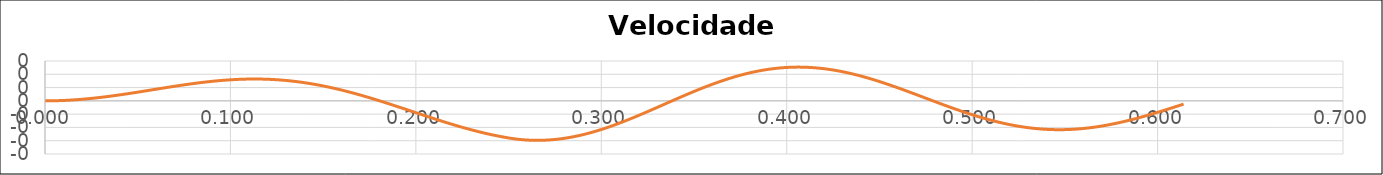
| Category | v (m/s) |
|---|---|
| 0.0 | 0 |
| 0.00028 | 0 |
| 0.00056 | 0 |
| 0.0008399999999999999 | 0 |
| 0.00112 | 0 |
| 0.0013999999999999998 | 0 |
| 0.0016799999999999996 | 0 |
| 0.0019599999999999995 | 0 |
| 0.0022399999999999994 | 0 |
| 0.0025199999999999992 | 0 |
| 0.002799999999999999 | 0 |
| 0.003079999999999999 | 0 |
| 0.003359999999999999 | 0 |
| 0.0036399999999999987 | 0 |
| 0.003919999999999999 | 0 |
| 0.004199999999999999 | 0.001 |
| 0.004479999999999999 | 0.001 |
| 0.004759999999999999 | 0.001 |
| 0.0050399999999999985 | 0.001 |
| 0.005319999999999998 | 0.001 |
| 0.005599999999999998 | 0.001 |
| 0.005879999999999998 | 0.001 |
| 0.006159999999999998 | 0.001 |
| 0.006439999999999998 | 0.001 |
| 0.006719999999999998 | 0.001 |
| 0.0069999999999999975 | 0.001 |
| 0.007279999999999997 | 0.002 |
| 0.007559999999999997 | 0.002 |
| 0.007839999999999998 | 0.002 |
| 0.008119999999999999 | 0.002 |
| 0.0084 | 0.002 |
| 0.00868 | 0.002 |
| 0.008960000000000001 | 0.002 |
| 0.009240000000000002 | 0.003 |
| 0.009520000000000002 | 0.003 |
| 0.009800000000000003 | 0.003 |
| 0.010080000000000004 | 0.003 |
| 0.010360000000000005 | 0.003 |
| 0.010640000000000005 | 0.003 |
| 0.010920000000000006 | 0.004 |
| 0.011200000000000007 | 0.004 |
| 0.011480000000000008 | 0.004 |
| 0.011760000000000008 | 0.004 |
| 0.012040000000000009 | 0.004 |
| 0.01232000000000001 | 0.005 |
| 0.01260000000000001 | 0.005 |
| 0.012880000000000011 | 0.005 |
| 0.013160000000000012 | 0.005 |
| 0.013440000000000013 | 0.005 |
| 0.013720000000000013 | 0.006 |
| 0.014000000000000014 | 0.006 |
| 0.014280000000000015 | 0.006 |
| 0.014560000000000016 | 0.006 |
| 0.014840000000000016 | 0.007 |
| 0.015120000000000017 | 0.007 |
| 0.015400000000000018 | 0.007 |
| 0.015680000000000017 | 0.007 |
| 0.015960000000000016 | 0.008 |
| 0.016240000000000015 | 0.008 |
| 0.016520000000000014 | 0.008 |
| 0.016800000000000013 | 0.008 |
| 0.017080000000000012 | 0.009 |
| 0.01736000000000001 | 0.009 |
| 0.01764000000000001 | 0.009 |
| 0.01792000000000001 | 0.01 |
| 0.018200000000000008 | 0.01 |
| 0.018480000000000007 | 0.01 |
| 0.018760000000000006 | 0.011 |
| 0.019040000000000005 | 0.011 |
| 0.019320000000000004 | 0.011 |
| 0.019600000000000003 | 0.011 |
| 0.019880000000000002 | 0.012 |
| 0.02016 | 0.012 |
| 0.02044 | 0.012 |
| 0.02072 | 0.013 |
| 0.020999999999999998 | 0.013 |
| 0.021279999999999997 | 0.013 |
| 0.021559999999999996 | 0.014 |
| 0.021839999999999995 | 0.014 |
| 0.022119999999999994 | 0.015 |
| 0.022399999999999993 | 0.015 |
| 0.022679999999999992 | 0.015 |
| 0.02295999999999999 | 0.016 |
| 0.02323999999999999 | 0.016 |
| 0.02351999999999999 | 0.016 |
| 0.023799999999999988 | 0.017 |
| 0.024079999999999987 | 0.017 |
| 0.024359999999999986 | 0.018 |
| 0.024639999999999985 | 0.018 |
| 0.024919999999999984 | 0.018 |
| 0.025199999999999983 | 0.019 |
| 0.025479999999999982 | 0.019 |
| 0.02575999999999998 | 0.02 |
| 0.02603999999999998 | 0.02 |
| 0.02631999999999998 | 0.02 |
| 0.026599999999999978 | 0.021 |
| 0.026879999999999977 | 0.021 |
| 0.027159999999999976 | 0.022 |
| 0.027439999999999975 | 0.022 |
| 0.027719999999999974 | 0.022 |
| 0.027999999999999973 | 0.023 |
| 0.028279999999999972 | 0.023 |
| 0.02855999999999997 | 0.024 |
| 0.02883999999999997 | 0.024 |
| 0.02911999999999997 | 0.025 |
| 0.029399999999999968 | 0.025 |
| 0.029679999999999967 | 0.026 |
| 0.029959999999999966 | 0.026 |
| 0.030239999999999965 | 0.026 |
| 0.030519999999999964 | 0.027 |
| 0.030799999999999963 | 0.027 |
| 0.031079999999999962 | 0.028 |
| 0.031359999999999964 | 0.028 |
| 0.03163999999999997 | 0.029 |
| 0.03191999999999997 | 0.029 |
| 0.03219999999999997 | 0.03 |
| 0.032479999999999974 | 0.03 |
| 0.03275999999999998 | 0.031 |
| 0.03303999999999998 | 0.031 |
| 0.03331999999999998 | 0.032 |
| 0.033599999999999984 | 0.032 |
| 0.033879999999999987 | 0.033 |
| 0.03415999999999999 | 0.033 |
| 0.03443999999999999 | 0.034 |
| 0.034719999999999994 | 0.034 |
| 0.034999999999999996 | 0.035 |
| 0.03528 | 0.035 |
| 0.03556 | 0.036 |
| 0.035840000000000004 | 0.036 |
| 0.036120000000000006 | 0.037 |
| 0.03640000000000001 | 0.037 |
| 0.03668000000000001 | 0.038 |
| 0.036960000000000014 | 0.038 |
| 0.037240000000000016 | 0.039 |
| 0.03752000000000002 | 0.04 |
| 0.03780000000000002 | 0.04 |
| 0.038080000000000024 | 0.041 |
| 0.038360000000000026 | 0.041 |
| 0.03864000000000003 | 0.042 |
| 0.03892000000000003 | 0.042 |
| 0.03920000000000003 | 0.043 |
| 0.039480000000000036 | 0.043 |
| 0.03976000000000004 | 0.044 |
| 0.04004000000000004 | 0.044 |
| 0.04032000000000004 | 0.045 |
| 0.040600000000000046 | 0.046 |
| 0.04088000000000005 | 0.046 |
| 0.04116000000000005 | 0.047 |
| 0.04144000000000005 | 0.047 |
| 0.041720000000000056 | 0.048 |
| 0.04200000000000006 | 0.048 |
| 0.04228000000000006 | 0.049 |
| 0.04256000000000006 | 0.05 |
| 0.042840000000000066 | 0.05 |
| 0.04312000000000007 | 0.051 |
| 0.04340000000000007 | 0.051 |
| 0.04368000000000007 | 0.052 |
| 0.043960000000000075 | 0.052 |
| 0.04424000000000008 | 0.053 |
| 0.04452000000000008 | 0.054 |
| 0.04480000000000008 | 0.054 |
| 0.045080000000000085 | 0.055 |
| 0.04536000000000009 | 0.055 |
| 0.04564000000000009 | 0.056 |
| 0.04592000000000009 | 0.057 |
| 0.046200000000000095 | 0.057 |
| 0.0464800000000001 | 0.058 |
| 0.0467600000000001 | 0.058 |
| 0.0470400000000001 | 0.059 |
| 0.047320000000000105 | 0.06 |
| 0.04760000000000011 | 0.06 |
| 0.04788000000000011 | 0.061 |
| 0.04816000000000011 | 0.061 |
| 0.048440000000000115 | 0.062 |
| 0.04872000000000012 | 0.063 |
| 0.04900000000000012 | 0.063 |
| 0.04928000000000012 | 0.064 |
| 0.049560000000000125 | 0.065 |
| 0.04984000000000013 | 0.065 |
| 0.05012000000000013 | 0.066 |
| 0.05040000000000013 | 0.066 |
| 0.050680000000000135 | 0.067 |
| 0.05096000000000014 | 0.068 |
| 0.05124000000000014 | 0.068 |
| 0.05152000000000014 | 0.069 |
| 0.051800000000000145 | 0.069 |
| 0.05208000000000015 | 0.07 |
| 0.05236000000000015 | 0.071 |
| 0.05264000000000015 | 0.071 |
| 0.052920000000000154 | 0.072 |
| 0.05320000000000016 | 0.073 |
| 0.05348000000000016 | 0.073 |
| 0.05376000000000016 | 0.074 |
| 0.054040000000000164 | 0.074 |
| 0.05432000000000017 | 0.075 |
| 0.05460000000000017 | 0.076 |
| 0.05488000000000017 | 0.076 |
| 0.055160000000000174 | 0.077 |
| 0.05544000000000018 | 0.078 |
| 0.05572000000000018 | 0.078 |
| 0.05600000000000018 | 0.079 |
| 0.056280000000000184 | 0.08 |
| 0.056560000000000187 | 0.08 |
| 0.05684000000000019 | 0.081 |
| 0.05712000000000019 | 0.081 |
| 0.057400000000000194 | 0.082 |
| 0.057680000000000196 | 0.083 |
| 0.0579600000000002 | 0.083 |
| 0.0582400000000002 | 0.084 |
| 0.058520000000000204 | 0.085 |
| 0.058800000000000206 | 0.085 |
| 0.05908000000000021 | 0.086 |
| 0.05936000000000021 | 0.086 |
| 0.059640000000000214 | 0.087 |
| 0.059920000000000216 | 0.088 |
| 0.06020000000000022 | 0.088 |
| 0.06048000000000022 | 0.089 |
| 0.060760000000000224 | 0.09 |
| 0.061040000000000226 | 0.09 |
| 0.06132000000000023 | 0.091 |
| 0.06160000000000023 | 0.092 |
| 0.06188000000000023 | 0.092 |
| 0.062160000000000236 | 0.093 |
| 0.06244000000000024 | 0.093 |
| 0.06272000000000023 | 0.094 |
| 0.06300000000000024 | 0.095 |
| 0.06328000000000024 | 0.095 |
| 0.06356000000000024 | 0.096 |
| 0.06384000000000024 | 0.097 |
| 0.06412000000000025 | 0.097 |
| 0.06440000000000025 | 0.098 |
| 0.06468000000000025 | 0.098 |
| 0.06496000000000025 | 0.099 |
| 0.06524000000000026 | 0.1 |
| 0.06552000000000026 | 0.1 |
| 0.06580000000000026 | 0.101 |
| 0.06608000000000026 | 0.102 |
| 0.06636000000000027 | 0.102 |
| 0.06664000000000027 | 0.103 |
| 0.06692000000000027 | 0.103 |
| 0.06720000000000027 | 0.104 |
| 0.06748000000000028 | 0.105 |
| 0.06776000000000028 | 0.105 |
| 0.06804000000000028 | 0.106 |
| 0.06832000000000028 | 0.106 |
| 0.06860000000000029 | 0.107 |
| 0.06888000000000029 | 0.108 |
| 0.06916000000000029 | 0.108 |
| 0.0694400000000003 | 0.109 |
| 0.0697200000000003 | 0.109 |
| 0.0700000000000003 | 0.11 |
| 0.0702800000000003 | 0.111 |
| 0.0705600000000003 | 0.111 |
| 0.0708400000000003 | 0.112 |
| 0.07112000000000031 | 0.112 |
| 0.07140000000000031 | 0.113 |
| 0.07168000000000031 | 0.114 |
| 0.07196000000000032 | 0.114 |
| 0.07224000000000032 | 0.115 |
| 0.07252000000000032 | 0.115 |
| 0.07280000000000032 | 0.116 |
| 0.07308000000000033 | 0.117 |
| 0.07336000000000033 | 0.117 |
| 0.07364000000000033 | 0.118 |
| 0.07392000000000033 | 0.118 |
| 0.07420000000000034 | 0.119 |
| 0.07448000000000034 | 0.119 |
| 0.07476000000000034 | 0.12 |
| 0.07504000000000034 | 0.121 |
| 0.07532000000000035 | 0.121 |
| 0.07560000000000035 | 0.122 |
| 0.07588000000000035 | 0.122 |
| 0.07616000000000035 | 0.123 |
| 0.07644000000000035 | 0.123 |
| 0.07672000000000036 | 0.124 |
| 0.07700000000000036 | 0.124 |
| 0.07728000000000036 | 0.125 |
| 0.07756000000000036 | 0.126 |
| 0.07784000000000037 | 0.126 |
| 0.07812000000000037 | 0.127 |
| 0.07840000000000037 | 0.127 |
| 0.07868000000000037 | 0.128 |
| 0.07896000000000038 | 0.128 |
| 0.07924000000000038 | 0.129 |
| 0.07952000000000038 | 0.129 |
| 0.07980000000000038 | 0.13 |
| 0.08008000000000039 | 0.13 |
| 0.08036000000000039 | 0.131 |
| 0.08064000000000039 | 0.131 |
| 0.0809200000000004 | 0.132 |
| 0.0812000000000004 | 0.132 |
| 0.0814800000000004 | 0.133 |
| 0.0817600000000004 | 0.133 |
| 0.0820400000000004 | 0.134 |
| 0.0823200000000004 | 0.134 |
| 0.08260000000000041 | 0.135 |
| 0.08288000000000041 | 0.135 |
| 0.08316000000000041 | 0.136 |
| 0.08344000000000042 | 0.136 |
| 0.08372000000000042 | 0.137 |
| 0.08400000000000042 | 0.137 |
| 0.08428000000000042 | 0.138 |
| 0.08456000000000043 | 0.138 |
| 0.08484000000000043 | 0.139 |
| 0.08512000000000043 | 0.139 |
| 0.08540000000000043 | 0.14 |
| 0.08568000000000044 | 0.14 |
| 0.08596000000000044 | 0.141 |
| 0.08624000000000044 | 0.141 |
| 0.08652000000000044 | 0.142 |
| 0.08680000000000045 | 0.142 |
| 0.08708000000000045 | 0.142 |
| 0.08736000000000045 | 0.143 |
| 0.08764000000000045 | 0.143 |
| 0.08792000000000046 | 0.144 |
| 0.08820000000000046 | 0.144 |
| 0.08848000000000046 | 0.145 |
| 0.08876000000000046 | 0.145 |
| 0.08904000000000047 | 0.145 |
| 0.08932000000000047 | 0.146 |
| 0.08960000000000047 | 0.146 |
| 0.08988000000000047 | 0.147 |
| 0.09016000000000048 | 0.147 |
| 0.09044000000000048 | 0.147 |
| 0.09072000000000048 | 0.148 |
| 0.09100000000000048 | 0.148 |
| 0.09128000000000049 | 0.149 |
| 0.09156000000000049 | 0.149 |
| 0.09184000000000049 | 0.149 |
| 0.0921200000000005 | 0.15 |
| 0.0924000000000005 | 0.15 |
| 0.0926800000000005 | 0.15 |
| 0.0929600000000005 | 0.151 |
| 0.0932400000000005 | 0.151 |
| 0.0935200000000005 | 0.152 |
| 0.09380000000000051 | 0.152 |
| 0.09408000000000051 | 0.152 |
| 0.09436000000000051 | 0.153 |
| 0.09464000000000052 | 0.153 |
| 0.09492000000000052 | 0.153 |
| 0.09520000000000052 | 0.154 |
| 0.09548000000000052 | 0.154 |
| 0.09576000000000053 | 0.154 |
| 0.09604000000000053 | 0.155 |
| 0.09632000000000053 | 0.155 |
| 0.09660000000000053 | 0.155 |
| 0.09688000000000054 | 0.155 |
| 0.09716000000000054 | 0.156 |
| 0.09744000000000054 | 0.156 |
| 0.09772000000000054 | 0.156 |
| 0.09800000000000055 | 0.157 |
| 0.09828000000000055 | 0.157 |
| 0.09856000000000055 | 0.157 |
| 0.09884000000000055 | 0.157 |
| 0.09912000000000055 | 0.158 |
| 0.09940000000000056 | 0.158 |
| 0.09968000000000056 | 0.158 |
| 0.09996000000000056 | 0.158 |
| 0.10024000000000056 | 0.159 |
| 0.10052000000000057 | 0.159 |
| 0.10080000000000057 | 0.159 |
| 0.10108000000000057 | 0.159 |
| 0.10136000000000057 | 0.16 |
| 0.10164000000000058 | 0.16 |
| 0.10192000000000058 | 0.16 |
| 0.10220000000000058 | 0.16 |
| 0.10248000000000058 | 0.16 |
| 0.10276000000000059 | 0.161 |
| 0.10304000000000059 | 0.161 |
| 0.10332000000000059 | 0.161 |
| 0.1036000000000006 | 0.161 |
| 0.1038800000000006 | 0.161 |
| 0.1041600000000006 | 0.162 |
| 0.1044400000000006 | 0.162 |
| 0.1047200000000006 | 0.162 |
| 0.1050000000000006 | 0.162 |
| 0.10528000000000061 | 0.162 |
| 0.10556000000000061 | 0.162 |
| 0.10584000000000061 | 0.163 |
| 0.10612000000000062 | 0.163 |
| 0.10640000000000062 | 0.163 |
| 0.10668000000000062 | 0.163 |
| 0.10696000000000062 | 0.163 |
| 0.10724000000000063 | 0.163 |
| 0.10752000000000063 | 0.163 |
| 0.10780000000000063 | 0.163 |
| 0.10808000000000063 | 0.163 |
| 0.10836000000000064 | 0.164 |
| 0.10864000000000064 | 0.164 |
| 0.10892000000000064 | 0.164 |
| 0.10920000000000064 | 0.164 |
| 0.10948000000000065 | 0.164 |
| 0.10976000000000065 | 0.164 |
| 0.11004000000000065 | 0.164 |
| 0.11032000000000065 | 0.164 |
| 0.11060000000000066 | 0.164 |
| 0.11088000000000066 | 0.164 |
| 0.11116000000000066 | 0.164 |
| 0.11144000000000066 | 0.164 |
| 0.11172000000000067 | 0.164 |
| 0.11200000000000067 | 0.164 |
| 0.11228000000000067 | 0.164 |
| 0.11256000000000067 | 0.164 |
| 0.11284000000000068 | 0.164 |
| 0.11312000000000068 | 0.164 |
| 0.11340000000000068 | 0.164 |
| 0.11368000000000068 | 0.164 |
| 0.11396000000000069 | 0.164 |
| 0.11424000000000069 | 0.164 |
| 0.11452000000000069 | 0.164 |
| 0.1148000000000007 | 0.164 |
| 0.1150800000000007 | 0.164 |
| 0.1153600000000007 | 0.164 |
| 0.1156400000000007 | 0.164 |
| 0.1159200000000007 | 0.164 |
| 0.1162000000000007 | 0.164 |
| 0.11648000000000071 | 0.164 |
| 0.11676000000000071 | 0.164 |
| 0.11704000000000071 | 0.164 |
| 0.11732000000000072 | 0.164 |
| 0.11760000000000072 | 0.164 |
| 0.11788000000000072 | 0.163 |
| 0.11816000000000072 | 0.163 |
| 0.11844000000000073 | 0.163 |
| 0.11872000000000073 | 0.163 |
| 0.11900000000000073 | 0.163 |
| 0.11928000000000073 | 0.163 |
| 0.11956000000000074 | 0.163 |
| 0.11984000000000074 | 0.163 |
| 0.12012000000000074 | 0.162 |
| 0.12040000000000074 | 0.162 |
| 0.12068000000000075 | 0.162 |
| 0.12096000000000075 | 0.162 |
| 0.12124000000000075 | 0.162 |
| 0.12152000000000075 | 0.162 |
| 0.12180000000000075 | 0.161 |
| 0.12208000000000076 | 0.161 |
| 0.12236000000000076 | 0.161 |
| 0.12264000000000076 | 0.161 |
| 0.12292000000000076 | 0.161 |
| 0.12320000000000077 | 0.16 |
| 0.12348000000000077 | 0.16 |
| 0.12376000000000077 | 0.16 |
| 0.12404000000000077 | 0.16 |
| 0.12432000000000078 | 0.16 |
| 0.12460000000000078 | 0.159 |
| 0.12488000000000078 | 0.159 |
| 0.12516000000000077 | 0.159 |
| 0.12544000000000077 | 0.158 |
| 0.12572000000000078 | 0.158 |
| 0.12600000000000078 | 0.158 |
| 0.12628000000000078 | 0.158 |
| 0.12656000000000078 | 0.157 |
| 0.12684000000000079 | 0.157 |
| 0.1271200000000008 | 0.157 |
| 0.1274000000000008 | 0.157 |
| 0.1276800000000008 | 0.156 |
| 0.1279600000000008 | 0.156 |
| 0.1282400000000008 | 0.156 |
| 0.1285200000000008 | 0.155 |
| 0.1288000000000008 | 0.155 |
| 0.1290800000000008 | 0.155 |
| 0.1293600000000008 | 0.154 |
| 0.1296400000000008 | 0.154 |
| 0.1299200000000008 | 0.154 |
| 0.13020000000000082 | 0.153 |
| 0.13048000000000082 | 0.153 |
| 0.13076000000000082 | 0.152 |
| 0.13104000000000082 | 0.152 |
| 0.13132000000000082 | 0.152 |
| 0.13160000000000083 | 0.151 |
| 0.13188000000000083 | 0.151 |
| 0.13216000000000083 | 0.15 |
| 0.13244000000000083 | 0.15 |
| 0.13272000000000084 | 0.15 |
| 0.13300000000000084 | 0.149 |
| 0.13328000000000084 | 0.149 |
| 0.13356000000000084 | 0.148 |
| 0.13384000000000085 | 0.148 |
| 0.13412000000000085 | 0.147 |
| 0.13440000000000085 | 0.147 |
| 0.13468000000000085 | 0.146 |
| 0.13496000000000086 | 0.146 |
| 0.13524000000000086 | 0.146 |
| 0.13552000000000086 | 0.145 |
| 0.13580000000000086 | 0.145 |
| 0.13608000000000087 | 0.144 |
| 0.13636000000000087 | 0.144 |
| 0.13664000000000087 | 0.143 |
| 0.13692000000000087 | 0.143 |
| 0.13720000000000088 | 0.142 |
| 0.13748000000000088 | 0.142 |
| 0.13776000000000088 | 0.141 |
| 0.13804000000000088 | 0.14 |
| 0.1383200000000009 | 0.14 |
| 0.1386000000000009 | 0.139 |
| 0.1388800000000009 | 0.139 |
| 0.1391600000000009 | 0.138 |
| 0.1394400000000009 | 0.138 |
| 0.1397200000000009 | 0.137 |
| 0.1400000000000009 | 0.137 |
| 0.1402800000000009 | 0.136 |
| 0.1405600000000009 | 0.135 |
| 0.1408400000000009 | 0.135 |
| 0.1411200000000009 | 0.134 |
| 0.1414000000000009 | 0.134 |
| 0.14168000000000092 | 0.133 |
| 0.14196000000000092 | 0.132 |
| 0.14224000000000092 | 0.132 |
| 0.14252000000000092 | 0.131 |
| 0.14280000000000093 | 0.131 |
| 0.14308000000000093 | 0.13 |
| 0.14336000000000093 | 0.129 |
| 0.14364000000000093 | 0.129 |
| 0.14392000000000094 | 0.128 |
| 0.14420000000000094 | 0.127 |
| 0.14448000000000094 | 0.127 |
| 0.14476000000000094 | 0.126 |
| 0.14504000000000095 | 0.125 |
| 0.14532000000000095 | 0.125 |
| 0.14560000000000095 | 0.124 |
| 0.14588000000000095 | 0.123 |
| 0.14616000000000096 | 0.122 |
| 0.14644000000000096 | 0.122 |
| 0.14672000000000096 | 0.121 |
| 0.14700000000000096 | 0.12 |
| 0.14728000000000097 | 0.12 |
| 0.14756000000000097 | 0.119 |
| 0.14784000000000097 | 0.118 |
| 0.14812000000000097 | 0.117 |
| 0.14840000000000098 | 0.117 |
| 0.14868000000000098 | 0.116 |
| 0.14896000000000098 | 0.115 |
| 0.14924000000000098 | 0.114 |
| 0.14952000000000099 | 0.114 |
| 0.149800000000001 | 0.113 |
| 0.150080000000001 | 0.112 |
| 0.150360000000001 | 0.111 |
| 0.150640000000001 | 0.11 |
| 0.150920000000001 | 0.11 |
| 0.151200000000001 | 0.109 |
| 0.151480000000001 | 0.108 |
| 0.151760000000001 | 0.107 |
| 0.152040000000001 | 0.106 |
| 0.152320000000001 | 0.106 |
| 0.152600000000001 | 0.105 |
| 0.15288000000000102 | 0.104 |
| 0.15316000000000102 | 0.103 |
| 0.15344000000000102 | 0.102 |
| 0.15372000000000102 | 0.101 |
| 0.15400000000000102 | 0.101 |
| 0.15428000000000103 | 0.1 |
| 0.15456000000000103 | 0.099 |
| 0.15484000000000103 | 0.098 |
| 0.15512000000000103 | 0.097 |
| 0.15540000000000104 | 0.096 |
| 0.15568000000000104 | 0.095 |
| 0.15596000000000104 | 0.094 |
| 0.15624000000000104 | 0.094 |
| 0.15652000000000105 | 0.093 |
| 0.15680000000000105 | 0.092 |
| 0.15708000000000105 | 0.091 |
| 0.15736000000000105 | 0.09 |
| 0.15764000000000106 | 0.089 |
| 0.15792000000000106 | 0.088 |
| 0.15820000000000106 | 0.087 |
| 0.15848000000000106 | 0.086 |
| 0.15876000000000107 | 0.085 |
| 0.15904000000000107 | 0.084 |
| 0.15932000000000107 | 0.083 |
| 0.15960000000000107 | 0.082 |
| 0.15988000000000108 | 0.081 |
| 0.16016000000000108 | 0.081 |
| 0.16044000000000108 | 0.08 |
| 0.16072000000000108 | 0.079 |
| 0.1610000000000011 | 0.078 |
| 0.1612800000000011 | 0.077 |
| 0.1615600000000011 | 0.076 |
| 0.1618400000000011 | 0.075 |
| 0.1621200000000011 | 0.074 |
| 0.1624000000000011 | 0.073 |
| 0.1626800000000011 | 0.072 |
| 0.1629600000000011 | 0.071 |
| 0.1632400000000011 | 0.07 |
| 0.1635200000000011 | 0.069 |
| 0.1638000000000011 | 0.068 |
| 0.1640800000000011 | 0.067 |
| 0.16436000000000112 | 0.066 |
| 0.16464000000000112 | 0.065 |
| 0.16492000000000112 | 0.063 |
| 0.16520000000000112 | 0.062 |
| 0.16548000000000113 | 0.061 |
| 0.16576000000000113 | 0.06 |
| 0.16604000000000113 | 0.059 |
| 0.16632000000000113 | 0.058 |
| 0.16660000000000114 | 0.057 |
| 0.16688000000000114 | 0.056 |
| 0.16716000000000114 | 0.055 |
| 0.16744000000000114 | 0.054 |
| 0.16772000000000115 | 0.053 |
| 0.16800000000000115 | 0.052 |
| 0.16828000000000115 | 0.051 |
| 0.16856000000000115 | 0.05 |
| 0.16884000000000116 | 0.049 |
| 0.16912000000000116 | 0.047 |
| 0.16940000000000116 | 0.046 |
| 0.16968000000000116 | 0.045 |
| 0.16996000000000117 | 0.044 |
| 0.17024000000000117 | 0.043 |
| 0.17052000000000117 | 0.042 |
| 0.17080000000000117 | 0.041 |
| 0.17108000000000118 | 0.04 |
| 0.17136000000000118 | 0.039 |
| 0.17164000000000118 | 0.037 |
| 0.17192000000000118 | 0.036 |
| 0.17220000000000119 | 0.035 |
| 0.1724800000000012 | 0.034 |
| 0.1727600000000012 | 0.033 |
| 0.1730400000000012 | 0.032 |
| 0.1733200000000012 | 0.031 |
| 0.1736000000000012 | 0.029 |
| 0.1738800000000012 | 0.028 |
| 0.1741600000000012 | 0.027 |
| 0.1744400000000012 | 0.026 |
| 0.1747200000000012 | 0.025 |
| 0.1750000000000012 | 0.024 |
| 0.1752800000000012 | 0.022 |
| 0.17556000000000122 | 0.021 |
| 0.17584000000000122 | 0.02 |
| 0.17612000000000122 | 0.019 |
| 0.17640000000000122 | 0.018 |
| 0.17668000000000122 | 0.016 |
| 0.17696000000000123 | 0.015 |
| 0.17724000000000123 | 0.014 |
| 0.17752000000000123 | 0.013 |
| 0.17780000000000123 | 0.012 |
| 0.17808000000000124 | 0.01 |
| 0.17836000000000124 | 0.009 |
| 0.17864000000000124 | 0.008 |
| 0.17892000000000124 | 0.007 |
| 0.17920000000000125 | 0.006 |
| 0.17948000000000125 | 0.004 |
| 0.17976000000000125 | 0.003 |
| 0.18004000000000125 | 0.002 |
| 0.18032000000000126 | 0.001 |
| 0.18060000000000126 | 0 |
| 0.18088000000000126 | -0.002 |
| 0.18116000000000126 | -0.003 |
| 0.18144000000000127 | -0.004 |
| 0.18172000000000127 | -0.005 |
| 0.18200000000000127 | -0.007 |
| 0.18228000000000127 | -0.008 |
| 0.18256000000000128 | -0.009 |
| 0.18284000000000128 | -0.01 |
| 0.18312000000000128 | -0.012 |
| 0.18340000000000128 | -0.013 |
| 0.1836800000000013 | -0.014 |
| 0.1839600000000013 | -0.015 |
| 0.1842400000000013 | -0.017 |
| 0.1845200000000013 | -0.018 |
| 0.1848000000000013 | -0.019 |
| 0.1850800000000013 | -0.02 |
| 0.1853600000000013 | -0.022 |
| 0.1856400000000013 | -0.023 |
| 0.1859200000000013 | -0.024 |
| 0.1862000000000013 | -0.025 |
| 0.1864800000000013 | -0.027 |
| 0.1867600000000013 | -0.028 |
| 0.18704000000000132 | -0.029 |
| 0.18732000000000132 | -0.03 |
| 0.18760000000000132 | -0.032 |
| 0.18788000000000132 | -0.033 |
| 0.18816000000000133 | -0.034 |
| 0.18844000000000133 | -0.036 |
| 0.18872000000000133 | -0.037 |
| 0.18900000000000133 | -0.038 |
| 0.18928000000000134 | -0.039 |
| 0.18956000000000134 | -0.041 |
| 0.18984000000000134 | -0.042 |
| 0.19012000000000134 | -0.043 |
| 0.19040000000000135 | -0.045 |
| 0.19068000000000135 | -0.046 |
| 0.19096000000000135 | -0.047 |
| 0.19124000000000135 | -0.048 |
| 0.19152000000000136 | -0.05 |
| 0.19180000000000136 | -0.051 |
| 0.19208000000000136 | -0.052 |
| 0.19236000000000136 | -0.054 |
| 0.19264000000000137 | -0.055 |
| 0.19292000000000137 | -0.056 |
| 0.19320000000000137 | -0.057 |
| 0.19348000000000137 | -0.059 |
| 0.19376000000000138 | -0.06 |
| 0.19404000000000138 | -0.061 |
| 0.19432000000000138 | -0.063 |
| 0.19460000000000138 | -0.064 |
| 0.19488000000000139 | -0.065 |
| 0.1951600000000014 | -0.067 |
| 0.1954400000000014 | -0.068 |
| 0.1957200000000014 | -0.069 |
| 0.1960000000000014 | -0.07 |
| 0.1962800000000014 | -0.072 |
| 0.1965600000000014 | -0.073 |
| 0.1968400000000014 | -0.074 |
| 0.1971200000000014 | -0.076 |
| 0.1974000000000014 | -0.077 |
| 0.1976800000000014 | -0.078 |
| 0.1979600000000014 | -0.08 |
| 0.19824000000000142 | -0.081 |
| 0.19852000000000142 | -0.082 |
| 0.19880000000000142 | -0.083 |
| 0.19908000000000142 | -0.085 |
| 0.19936000000000142 | -0.086 |
| 0.19964000000000143 | -0.087 |
| 0.19992000000000143 | -0.089 |
| 0.20020000000000143 | -0.09 |
| 0.20048000000000143 | -0.091 |
| 0.20076000000000144 | -0.093 |
| 0.20104000000000144 | -0.094 |
| 0.20132000000000144 | -0.095 |
| 0.20160000000000144 | -0.096 |
| 0.20188000000000145 | -0.098 |
| 0.20216000000000145 | -0.099 |
| 0.20244000000000145 | -0.1 |
| 0.20272000000000145 | -0.102 |
| 0.20300000000000146 | -0.103 |
| 0.20328000000000146 | -0.104 |
| 0.20356000000000146 | -0.105 |
| 0.20384000000000146 | -0.107 |
| 0.20412000000000147 | -0.108 |
| 0.20440000000000147 | -0.109 |
| 0.20468000000000147 | -0.111 |
| 0.20496000000000147 | -0.112 |
| 0.20524000000000148 | -0.113 |
| 0.20552000000000148 | -0.115 |
| 0.20580000000000148 | -0.116 |
| 0.20608000000000148 | -0.117 |
| 0.2063600000000015 | -0.118 |
| 0.2066400000000015 | -0.12 |
| 0.2069200000000015 | -0.121 |
| 0.2072000000000015 | -0.122 |
| 0.2074800000000015 | -0.123 |
| 0.2077600000000015 | -0.125 |
| 0.2080400000000015 | -0.126 |
| 0.2083200000000015 | -0.127 |
| 0.2086000000000015 | -0.129 |
| 0.2088800000000015 | -0.13 |
| 0.2091600000000015 | -0.131 |
| 0.2094400000000015 | -0.132 |
| 0.20972000000000152 | -0.134 |
| 0.21000000000000152 | -0.135 |
| 0.21028000000000152 | -0.136 |
| 0.21056000000000152 | -0.137 |
| 0.21084000000000153 | -0.139 |
| 0.21112000000000153 | -0.14 |
| 0.21140000000000153 | -0.141 |
| 0.21168000000000153 | -0.142 |
| 0.21196000000000154 | -0.144 |
| 0.21224000000000154 | -0.145 |
| 0.21252000000000154 | -0.146 |
| 0.21280000000000154 | -0.147 |
| 0.21308000000000155 | -0.149 |
| 0.21336000000000155 | -0.15 |
| 0.21364000000000155 | -0.151 |
| 0.21392000000000155 | -0.152 |
| 0.21420000000000156 | -0.154 |
| 0.21448000000000156 | -0.155 |
| 0.21476000000000156 | -0.156 |
| 0.21504000000000156 | -0.157 |
| 0.21532000000000157 | -0.158 |
| 0.21560000000000157 | -0.16 |
| 0.21588000000000157 | -0.161 |
| 0.21616000000000157 | -0.162 |
| 0.21644000000000158 | -0.163 |
| 0.21672000000000158 | -0.165 |
| 0.21700000000000158 | -0.166 |
| 0.21728000000000158 | -0.167 |
| 0.21756000000000159 | -0.168 |
| 0.2178400000000016 | -0.169 |
| 0.2181200000000016 | -0.171 |
| 0.2184000000000016 | -0.172 |
| 0.2186800000000016 | -0.173 |
| 0.2189600000000016 | -0.174 |
| 0.2192400000000016 | -0.175 |
| 0.2195200000000016 | -0.177 |
| 0.2198000000000016 | -0.178 |
| 0.2200800000000016 | -0.179 |
| 0.2203600000000016 | -0.18 |
| 0.2206400000000016 | -0.181 |
| 0.22092000000000162 | -0.182 |
| 0.22120000000000162 | -0.184 |
| 0.22148000000000162 | -0.185 |
| 0.22176000000000162 | -0.186 |
| 0.22204000000000162 | -0.187 |
| 0.22232000000000163 | -0.188 |
| 0.22260000000000163 | -0.189 |
| 0.22288000000000163 | -0.19 |
| 0.22316000000000163 | -0.192 |
| 0.22344000000000164 | -0.193 |
| 0.22372000000000164 | -0.194 |
| 0.22400000000000164 | -0.195 |
| 0.22428000000000164 | -0.196 |
| 0.22456000000000165 | -0.197 |
| 0.22484000000000165 | -0.198 |
| 0.22512000000000165 | -0.199 |
| 0.22540000000000165 | -0.201 |
| 0.22568000000000166 | -0.202 |
| 0.22596000000000166 | -0.203 |
| 0.22624000000000166 | -0.204 |
| 0.22652000000000166 | -0.205 |
| 0.22680000000000167 | -0.206 |
| 0.22708000000000167 | -0.207 |
| 0.22736000000000167 | -0.208 |
| 0.22764000000000167 | -0.209 |
| 0.22792000000000168 | -0.21 |
| 0.22820000000000168 | -0.211 |
| 0.22848000000000168 | -0.212 |
| 0.22876000000000168 | -0.214 |
| 0.2290400000000017 | -0.215 |
| 0.2293200000000017 | -0.216 |
| 0.2296000000000017 | -0.217 |
| 0.2298800000000017 | -0.218 |
| 0.2301600000000017 | -0.219 |
| 0.2304400000000017 | -0.22 |
| 0.2307200000000017 | -0.221 |
| 0.2310000000000017 | -0.222 |
| 0.2312800000000017 | -0.223 |
| 0.2315600000000017 | -0.224 |
| 0.2318400000000017 | -0.225 |
| 0.2321200000000017 | -0.226 |
| 0.23240000000000172 | -0.227 |
| 0.23268000000000172 | -0.228 |
| 0.23296000000000172 | -0.229 |
| 0.23324000000000172 | -0.23 |
| 0.23352000000000173 | -0.231 |
| 0.23380000000000173 | -0.232 |
| 0.23408000000000173 | -0.233 |
| 0.23436000000000173 | -0.234 |
| 0.23464000000000174 | -0.235 |
| 0.23492000000000174 | -0.236 |
| 0.23520000000000174 | -0.237 |
| 0.23548000000000174 | -0.238 |
| 0.23576000000000175 | -0.239 |
| 0.23604000000000175 | -0.239 |
| 0.23632000000000175 | -0.24 |
| 0.23660000000000175 | -0.241 |
| 0.23688000000000176 | -0.242 |
| 0.23716000000000176 | -0.243 |
| 0.23744000000000176 | -0.244 |
| 0.23772000000000176 | -0.245 |
| 0.23800000000000177 | -0.246 |
| 0.23828000000000177 | -0.247 |
| 0.23856000000000177 | -0.248 |
| 0.23884000000000177 | -0.249 |
| 0.23912000000000178 | -0.249 |
| 0.23940000000000178 | -0.25 |
| 0.23968000000000178 | -0.251 |
| 0.23996000000000178 | -0.252 |
| 0.24024000000000179 | -0.253 |
| 0.2405200000000018 | -0.254 |
| 0.2408000000000018 | -0.255 |
| 0.2410800000000018 | -0.255 |
| 0.2413600000000018 | -0.256 |
| 0.2416400000000018 | -0.257 |
| 0.2419200000000018 | -0.258 |
| 0.2422000000000018 | -0.259 |
| 0.2424800000000018 | -0.26 |
| 0.2427600000000018 | -0.26 |
| 0.2430400000000018 | -0.261 |
| 0.2433200000000018 | -0.262 |
| 0.24360000000000182 | -0.263 |
| 0.24388000000000182 | -0.263 |
| 0.24416000000000182 | -0.264 |
| 0.24444000000000182 | -0.265 |
| 0.24472000000000182 | -0.266 |
| 0.24500000000000183 | -0.267 |
| 0.24528000000000183 | -0.267 |
| 0.24556000000000183 | -0.268 |
| 0.24584000000000183 | -0.269 |
| 0.24612000000000184 | -0.27 |
| 0.24640000000000184 | -0.27 |
| 0.24668000000000184 | -0.271 |
| 0.24696000000000184 | -0.272 |
| 0.24724000000000185 | -0.272 |
| 0.24752000000000185 | -0.273 |
| 0.24780000000000185 | -0.274 |
| 0.24808000000000185 | -0.275 |
| 0.24836000000000186 | -0.275 |
| 0.24864000000000186 | -0.276 |
| 0.24892000000000186 | -0.277 |
| 0.24920000000000186 | -0.277 |
| 0.24948000000000187 | -0.278 |
| 0.24976000000000187 | -0.279 |
| 0.25004000000000187 | -0.279 |
| 0.2503200000000019 | -0.28 |
| 0.2506000000000019 | -0.28 |
| 0.2508800000000019 | -0.281 |
| 0.2511600000000019 | -0.282 |
| 0.2514400000000019 | -0.282 |
| 0.2517200000000019 | -0.283 |
| 0.2520000000000019 | -0.283 |
| 0.2522800000000019 | -0.284 |
| 0.2525600000000019 | -0.285 |
| 0.2528400000000019 | -0.285 |
| 0.2531200000000019 | -0.286 |
| 0.2534000000000019 | -0.286 |
| 0.2536800000000019 | -0.287 |
| 0.2539600000000019 | -0.287 |
| 0.2542400000000019 | -0.288 |
| 0.2545200000000019 | -0.288 |
| 0.2548000000000019 | -0.288 |
| 0.2550800000000019 | -0.289 |
| 0.2553600000000019 | -0.289 |
| 0.2556400000000019 | -0.29 |
| 0.2559200000000019 | -0.29 |
| 0.2562000000000019 | -0.291 |
| 0.25648000000000193 | -0.291 |
| 0.25676000000000193 | -0.291 |
| 0.25704000000000193 | -0.292 |
| 0.25732000000000194 | -0.292 |
| 0.25760000000000194 | -0.292 |
| 0.25788000000000194 | -0.293 |
| 0.25816000000000194 | -0.293 |
| 0.25844000000000195 | -0.293 |
| 0.25872000000000195 | -0.294 |
| 0.25900000000000195 | -0.294 |
| 0.25928000000000195 | -0.294 |
| 0.25956000000000196 | -0.294 |
| 0.25984000000000196 | -0.295 |
| 0.26012000000000196 | -0.295 |
| 0.26040000000000196 | -0.295 |
| 0.26068000000000197 | -0.295 |
| 0.26096000000000197 | -0.296 |
| 0.26124000000000197 | -0.296 |
| 0.261520000000002 | -0.296 |
| 0.261800000000002 | -0.296 |
| 0.262080000000002 | -0.296 |
| 0.262360000000002 | -0.296 |
| 0.262640000000002 | -0.297 |
| 0.262920000000002 | -0.297 |
| 0.263200000000002 | -0.297 |
| 0.263480000000002 | -0.297 |
| 0.263760000000002 | -0.297 |
| 0.264040000000002 | -0.297 |
| 0.264320000000002 | -0.297 |
| 0.264600000000002 | -0.297 |
| 0.264880000000002 | -0.297 |
| 0.265160000000002 | -0.297 |
| 0.265440000000002 | -0.297 |
| 0.265720000000002 | -0.297 |
| 0.266000000000002 | -0.297 |
| 0.266280000000002 | -0.297 |
| 0.266560000000002 | -0.297 |
| 0.266840000000002 | -0.297 |
| 0.267120000000002 | -0.297 |
| 0.267400000000002 | -0.297 |
| 0.267680000000002 | -0.297 |
| 0.26796000000000203 | -0.297 |
| 0.26824000000000203 | -0.297 |
| 0.26852000000000203 | -0.297 |
| 0.26880000000000204 | -0.296 |
| 0.26908000000000204 | -0.296 |
| 0.26936000000000204 | -0.296 |
| 0.26964000000000204 | -0.296 |
| 0.26992000000000205 | -0.296 |
| 0.27020000000000205 | -0.296 |
| 0.27048000000000205 | -0.295 |
| 0.27076000000000205 | -0.295 |
| 0.27104000000000206 | -0.295 |
| 0.27132000000000206 | -0.295 |
| 0.27160000000000206 | -0.295 |
| 0.27188000000000206 | -0.294 |
| 0.27216000000000207 | -0.294 |
| 0.27244000000000207 | -0.294 |
| 0.27272000000000207 | -0.293 |
| 0.2730000000000021 | -0.293 |
| 0.2732800000000021 | -0.293 |
| 0.2735600000000021 | -0.293 |
| 0.2738400000000021 | -0.292 |
| 0.2741200000000021 | -0.292 |
| 0.2744000000000021 | -0.291 |
| 0.2746800000000021 | -0.291 |
| 0.2749600000000021 | -0.291 |
| 0.2752400000000021 | -0.29 |
| 0.2755200000000021 | -0.29 |
| 0.2758000000000021 | -0.29 |
| 0.2760800000000021 | -0.289 |
| 0.2763600000000021 | -0.289 |
| 0.2766400000000021 | -0.288 |
| 0.2769200000000021 | -0.288 |
| 0.2772000000000021 | -0.287 |
| 0.2774800000000021 | -0.287 |
| 0.2777600000000021 | -0.286 |
| 0.2780400000000021 | -0.286 |
| 0.2783200000000021 | -0.285 |
| 0.2786000000000021 | -0.285 |
| 0.2788800000000021 | -0.284 |
| 0.27916000000000213 | -0.284 |
| 0.27944000000000213 | -0.283 |
| 0.27972000000000213 | -0.283 |
| 0.28000000000000214 | -0.282 |
| 0.28028000000000214 | -0.281 |
| 0.28056000000000214 | -0.281 |
| 0.28084000000000214 | -0.28 |
| 0.28112000000000215 | -0.28 |
| 0.28140000000000215 | -0.279 |
| 0.28168000000000215 | -0.278 |
| 0.28196000000000215 | -0.278 |
| 0.28224000000000216 | -0.277 |
| 0.28252000000000216 | -0.276 |
| 0.28280000000000216 | -0.276 |
| 0.28308000000000216 | -0.275 |
| 0.28336000000000217 | -0.274 |
| 0.28364000000000217 | -0.274 |
| 0.28392000000000217 | -0.273 |
| 0.2842000000000022 | -0.272 |
| 0.2844800000000022 | -0.271 |
| 0.2847600000000022 | -0.271 |
| 0.2850400000000022 | -0.27 |
| 0.2853200000000022 | -0.269 |
| 0.2856000000000022 | -0.268 |
| 0.2858800000000022 | -0.268 |
| 0.2861600000000022 | -0.267 |
| 0.2864400000000022 | -0.266 |
| 0.2867200000000022 | -0.265 |
| 0.2870000000000022 | -0.264 |
| 0.2872800000000022 | -0.263 |
| 0.2875600000000022 | -0.263 |
| 0.2878400000000022 | -0.262 |
| 0.2881200000000022 | -0.261 |
| 0.2884000000000022 | -0.26 |
| 0.2886800000000022 | -0.259 |
| 0.2889600000000022 | -0.258 |
| 0.2892400000000022 | -0.257 |
| 0.2895200000000022 | -0.256 |
| 0.2898000000000022 | -0.255 |
| 0.2900800000000022 | -0.255 |
| 0.2903600000000022 | -0.254 |
| 0.29064000000000223 | -0.253 |
| 0.29092000000000223 | -0.252 |
| 0.29120000000000223 | -0.251 |
| 0.29148000000000224 | -0.25 |
| 0.29176000000000224 | -0.249 |
| 0.29204000000000224 | -0.248 |
| 0.29232000000000224 | -0.247 |
| 0.29260000000000225 | -0.246 |
| 0.29288000000000225 | -0.245 |
| 0.29316000000000225 | -0.244 |
| 0.29344000000000225 | -0.243 |
| 0.29372000000000226 | -0.242 |
| 0.29400000000000226 | -0.24 |
| 0.29428000000000226 | -0.239 |
| 0.29456000000000226 | -0.238 |
| 0.29484000000000227 | -0.237 |
| 0.29512000000000227 | -0.236 |
| 0.29540000000000227 | -0.235 |
| 0.2956800000000023 | -0.234 |
| 0.2959600000000023 | -0.233 |
| 0.2962400000000023 | -0.232 |
| 0.2965200000000023 | -0.23 |
| 0.2968000000000023 | -0.229 |
| 0.2970800000000023 | -0.228 |
| 0.2973600000000023 | -0.227 |
| 0.2976400000000023 | -0.226 |
| 0.2979200000000023 | -0.225 |
| 0.2982000000000023 | -0.223 |
| 0.2984800000000023 | -0.222 |
| 0.2987600000000023 | -0.221 |
| 0.2990400000000023 | -0.22 |
| 0.2993200000000023 | -0.219 |
| 0.2996000000000023 | -0.217 |
| 0.2998800000000023 | -0.216 |
| 0.3001600000000023 | -0.215 |
| 0.3004400000000023 | -0.214 |
| 0.3007200000000023 | -0.212 |
| 0.3010000000000023 | -0.211 |
| 0.3012800000000023 | -0.21 |
| 0.3015600000000023 | -0.209 |
| 0.30184000000000233 | -0.207 |
| 0.30212000000000233 | -0.206 |
| 0.30240000000000233 | -0.205 |
| 0.30268000000000234 | -0.203 |
| 0.30296000000000234 | -0.202 |
| 0.30324000000000234 | -0.201 |
| 0.30352000000000234 | -0.199 |
| 0.30380000000000235 | -0.198 |
| 0.30408000000000235 | -0.197 |
| 0.30436000000000235 | -0.195 |
| 0.30464000000000235 | -0.194 |
| 0.30492000000000236 | -0.193 |
| 0.30520000000000236 | -0.191 |
| 0.30548000000000236 | -0.19 |
| 0.30576000000000236 | -0.188 |
| 0.30604000000000237 | -0.187 |
| 0.30632000000000237 | -0.186 |
| 0.30660000000000237 | -0.184 |
| 0.3068800000000024 | -0.183 |
| 0.3071600000000024 | -0.181 |
| 0.3074400000000024 | -0.18 |
| 0.3077200000000024 | -0.179 |
| 0.3080000000000024 | -0.177 |
| 0.3082800000000024 | -0.176 |
| 0.3085600000000024 | -0.174 |
| 0.3088400000000024 | -0.173 |
| 0.3091200000000024 | -0.171 |
| 0.3094000000000024 | -0.17 |
| 0.3096800000000024 | -0.168 |
| 0.3099600000000024 | -0.167 |
| 0.3102400000000024 | -0.165 |
| 0.3105200000000024 | -0.164 |
| 0.3108000000000024 | -0.162 |
| 0.3110800000000024 | -0.161 |
| 0.3113600000000024 | -0.159 |
| 0.3116400000000024 | -0.158 |
| 0.3119200000000024 | -0.156 |
| 0.3122000000000024 | -0.155 |
| 0.3124800000000024 | -0.153 |
| 0.3127600000000024 | -0.152 |
| 0.3130400000000024 | -0.15 |
| 0.31332000000000243 | -0.149 |
| 0.31360000000000243 | -0.147 |
| 0.31388000000000243 | -0.146 |
| 0.31416000000000244 | -0.144 |
| 0.31444000000000244 | -0.142 |
| 0.31472000000000244 | -0.141 |
| 0.31500000000000244 | -0.139 |
| 0.31528000000000245 | -0.138 |
| 0.31556000000000245 | -0.136 |
| 0.31584000000000245 | -0.135 |
| 0.31612000000000245 | -0.133 |
| 0.31640000000000246 | -0.131 |
| 0.31668000000000246 | -0.13 |
| 0.31696000000000246 | -0.128 |
| 0.31724000000000246 | -0.127 |
| 0.31752000000000247 | -0.125 |
| 0.31780000000000247 | -0.123 |
| 0.31808000000000247 | -0.122 |
| 0.3183600000000025 | -0.12 |
| 0.3186400000000025 | -0.119 |
| 0.3189200000000025 | -0.117 |
| 0.3192000000000025 | -0.115 |
| 0.3194800000000025 | -0.114 |
| 0.3197600000000025 | -0.112 |
| 0.3200400000000025 | -0.11 |
| 0.3203200000000025 | -0.109 |
| 0.3206000000000025 | -0.107 |
| 0.3208800000000025 | -0.105 |
| 0.3211600000000025 | -0.104 |
| 0.3214400000000025 | -0.102 |
| 0.3217200000000025 | -0.1 |
| 0.3220000000000025 | -0.099 |
| 0.3222800000000025 | -0.097 |
| 0.3225600000000025 | -0.095 |
| 0.3228400000000025 | -0.094 |
| 0.3231200000000025 | -0.092 |
| 0.3234000000000025 | -0.09 |
| 0.3236800000000025 | -0.089 |
| 0.3239600000000025 | -0.087 |
| 0.3242400000000025 | -0.085 |
| 0.32452000000000253 | -0.084 |
| 0.32480000000000253 | -0.082 |
| 0.32508000000000253 | -0.08 |
| 0.32536000000000254 | -0.079 |
| 0.32564000000000254 | -0.077 |
| 0.32592000000000254 | -0.075 |
| 0.32620000000000254 | -0.074 |
| 0.32648000000000255 | -0.072 |
| 0.32676000000000255 | -0.07 |
| 0.32704000000000255 | -0.068 |
| 0.32732000000000255 | -0.067 |
| 0.32760000000000256 | -0.065 |
| 0.32788000000000256 | -0.063 |
| 0.32816000000000256 | -0.062 |
| 0.32844000000000256 | -0.06 |
| 0.32872000000000257 | -0.058 |
| 0.32900000000000257 | -0.056 |
| 0.32928000000000257 | -0.055 |
| 0.3295600000000026 | -0.053 |
| 0.3298400000000026 | -0.051 |
| 0.3301200000000026 | -0.05 |
| 0.3304000000000026 | -0.048 |
| 0.3306800000000026 | -0.046 |
| 0.3309600000000026 | -0.044 |
| 0.3312400000000026 | -0.043 |
| 0.3315200000000026 | -0.041 |
| 0.3318000000000026 | -0.039 |
| 0.3320800000000026 | -0.038 |
| 0.3323600000000026 | -0.036 |
| 0.3326400000000026 | -0.034 |
| 0.3329200000000026 | -0.032 |
| 0.3332000000000026 | -0.031 |
| 0.3334800000000026 | -0.029 |
| 0.3337600000000026 | -0.027 |
| 0.3340400000000026 | -0.025 |
| 0.3343200000000026 | -0.024 |
| 0.3346000000000026 | -0.022 |
| 0.3348800000000026 | -0.02 |
| 0.3351600000000026 | -0.019 |
| 0.3354400000000026 | -0.017 |
| 0.3357200000000026 | -0.015 |
| 0.33600000000000263 | -0.013 |
| 0.33628000000000263 | -0.012 |
| 0.33656000000000263 | -0.01 |
| 0.33684000000000264 | -0.008 |
| 0.33712000000000264 | -0.006 |
| 0.33740000000000264 | -0.005 |
| 0.33768000000000264 | -0.003 |
| 0.33796000000000265 | -0.001 |
| 0.33824000000000265 | 0 |
| 0.33852000000000265 | 0.002 |
| 0.33880000000000265 | 0.004 |
| 0.33908000000000266 | 0.006 |
| 0.33936000000000266 | 0.007 |
| 0.33964000000000266 | 0.009 |
| 0.33992000000000266 | 0.011 |
| 0.34020000000000267 | 0.012 |
| 0.34048000000000267 | 0.014 |
| 0.34076000000000267 | 0.016 |
| 0.3410400000000027 | 0.017 |
| 0.3413200000000027 | 0.019 |
| 0.3416000000000027 | 0.021 |
| 0.3418800000000027 | 0.023 |
| 0.3421600000000027 | 0.024 |
| 0.3424400000000027 | 0.026 |
| 0.3427200000000027 | 0.028 |
| 0.3430000000000027 | 0.029 |
| 0.3432800000000027 | 0.031 |
| 0.3435600000000027 | 0.033 |
| 0.3438400000000027 | 0.034 |
| 0.3441200000000027 | 0.036 |
| 0.3444000000000027 | 0.038 |
| 0.3446800000000027 | 0.039 |
| 0.3449600000000027 | 0.041 |
| 0.3452400000000027 | 0.043 |
| 0.3455200000000027 | 0.044 |
| 0.3458000000000027 | 0.046 |
| 0.3460800000000027 | 0.048 |
| 0.3463600000000027 | 0.049 |
| 0.3466400000000027 | 0.051 |
| 0.3469200000000027 | 0.053 |
| 0.34720000000000273 | 0.054 |
| 0.34748000000000273 | 0.056 |
| 0.34776000000000273 | 0.058 |
| 0.34804000000000274 | 0.059 |
| 0.34832000000000274 | 0.061 |
| 0.34860000000000274 | 0.063 |
| 0.34888000000000274 | 0.064 |
| 0.34916000000000275 | 0.066 |
| 0.34944000000000275 | 0.067 |
| 0.34972000000000275 | 0.069 |
| 0.35000000000000275 | 0.071 |
| 0.35028000000000276 | 0.072 |
| 0.35056000000000276 | 0.074 |
| 0.35084000000000276 | 0.075 |
| 0.35112000000000276 | 0.077 |
| 0.35140000000000277 | 0.079 |
| 0.35168000000000277 | 0.08 |
| 0.35196000000000277 | 0.082 |
| 0.3522400000000028 | 0.083 |
| 0.3525200000000028 | 0.085 |
| 0.3528000000000028 | 0.087 |
| 0.3530800000000028 | 0.088 |
| 0.3533600000000028 | 0.09 |
| 0.3536400000000028 | 0.091 |
| 0.3539200000000028 | 0.093 |
| 0.3542000000000028 | 0.094 |
| 0.3544800000000028 | 0.096 |
| 0.3547600000000028 | 0.097 |
| 0.3550400000000028 | 0.099 |
| 0.3553200000000028 | 0.101 |
| 0.3556000000000028 | 0.102 |
| 0.3558800000000028 | 0.104 |
| 0.3561600000000028 | 0.105 |
| 0.3564400000000028 | 0.107 |
| 0.3567200000000028 | 0.108 |
| 0.3570000000000028 | 0.11 |
| 0.3572800000000028 | 0.111 |
| 0.3575600000000028 | 0.113 |
| 0.3578400000000028 | 0.114 |
| 0.3581200000000028 | 0.116 |
| 0.3584000000000028 | 0.117 |
| 0.35868000000000283 | 0.119 |
| 0.35896000000000283 | 0.12 |
| 0.35924000000000283 | 0.121 |
| 0.35952000000000284 | 0.123 |
| 0.35980000000000284 | 0.124 |
| 0.36008000000000284 | 0.126 |
| 0.36036000000000284 | 0.127 |
| 0.36064000000000285 | 0.129 |
| 0.36092000000000285 | 0.13 |
| 0.36120000000000285 | 0.131 |
| 0.36148000000000285 | 0.133 |
| 0.36176000000000286 | 0.134 |
| 0.36204000000000286 | 0.136 |
| 0.36232000000000286 | 0.137 |
| 0.36260000000000286 | 0.138 |
| 0.36288000000000287 | 0.14 |
| 0.36316000000000287 | 0.141 |
| 0.36344000000000287 | 0.143 |
| 0.3637200000000029 | 0.144 |
| 0.3640000000000029 | 0.145 |
| 0.3642800000000029 | 0.147 |
| 0.3645600000000029 | 0.148 |
| 0.3648400000000029 | 0.149 |
| 0.3651200000000029 | 0.151 |
| 0.3654000000000029 | 0.152 |
| 0.3656800000000029 | 0.153 |
| 0.3659600000000029 | 0.155 |
| 0.3662400000000029 | 0.156 |
| 0.3665200000000029 | 0.157 |
| 0.3668000000000029 | 0.159 |
| 0.3670800000000029 | 0.16 |
| 0.3673600000000029 | 0.161 |
| 0.3676400000000029 | 0.162 |
| 0.3679200000000029 | 0.164 |
| 0.3682000000000029 | 0.165 |
| 0.3684800000000029 | 0.166 |
| 0.3687600000000029 | 0.167 |
| 0.3690400000000029 | 0.169 |
| 0.3693200000000029 | 0.17 |
| 0.3696000000000029 | 0.171 |
| 0.36988000000000293 | 0.172 |
| 0.37016000000000293 | 0.173 |
| 0.37044000000000293 | 0.175 |
| 0.37072000000000294 | 0.176 |
| 0.37100000000000294 | 0.177 |
| 0.37128000000000294 | 0.178 |
| 0.37156000000000294 | 0.179 |
| 0.37184000000000295 | 0.18 |
| 0.37212000000000295 | 0.182 |
| 0.37240000000000295 | 0.183 |
| 0.37268000000000295 | 0.184 |
| 0.37296000000000296 | 0.185 |
| 0.37324000000000296 | 0.186 |
| 0.37352000000000296 | 0.187 |
| 0.37380000000000296 | 0.188 |
| 0.37408000000000297 | 0.189 |
| 0.37436000000000297 | 0.19 |
| 0.37464000000000297 | 0.192 |
| 0.374920000000003 | 0.193 |
| 0.375200000000003 | 0.194 |
| 0.375480000000003 | 0.195 |
| 0.375760000000003 | 0.196 |
| 0.376040000000003 | 0.197 |
| 0.376320000000003 | 0.198 |
| 0.376600000000003 | 0.199 |
| 0.376880000000003 | 0.2 |
| 0.377160000000003 | 0.201 |
| 0.377440000000003 | 0.202 |
| 0.377720000000003 | 0.203 |
| 0.378000000000003 | 0.204 |
| 0.378280000000003 | 0.205 |
| 0.378560000000003 | 0.206 |
| 0.378840000000003 | 0.207 |
| 0.379120000000003 | 0.208 |
| 0.379400000000003 | 0.209 |
| 0.379680000000003 | 0.209 |
| 0.379960000000003 | 0.21 |
| 0.380240000000003 | 0.211 |
| 0.380520000000003 | 0.212 |
| 0.380800000000003 | 0.213 |
| 0.381080000000003 | 0.214 |
| 0.38136000000000303 | 0.215 |
| 0.38164000000000303 | 0.216 |
| 0.38192000000000303 | 0.217 |
| 0.38220000000000304 | 0.217 |
| 0.38248000000000304 | 0.218 |
| 0.38276000000000304 | 0.219 |
| 0.38304000000000304 | 0.22 |
| 0.38332000000000305 | 0.221 |
| 0.38360000000000305 | 0.221 |
| 0.38388000000000305 | 0.222 |
| 0.38416000000000305 | 0.223 |
| 0.38444000000000306 | 0.224 |
| 0.38472000000000306 | 0.225 |
| 0.38500000000000306 | 0.225 |
| 0.38528000000000306 | 0.226 |
| 0.38556000000000307 | 0.227 |
| 0.38584000000000307 | 0.227 |
| 0.38612000000000307 | 0.228 |
| 0.3864000000000031 | 0.229 |
| 0.3866800000000031 | 0.23 |
| 0.3869600000000031 | 0.23 |
| 0.3872400000000031 | 0.231 |
| 0.3875200000000031 | 0.232 |
| 0.3878000000000031 | 0.232 |
| 0.3880800000000031 | 0.233 |
| 0.3883600000000031 | 0.234 |
| 0.3886400000000031 | 0.234 |
| 0.3889200000000031 | 0.235 |
| 0.3892000000000031 | 0.235 |
| 0.3894800000000031 | 0.236 |
| 0.3897600000000031 | 0.237 |
| 0.3900400000000031 | 0.237 |
| 0.3903200000000031 | 0.238 |
| 0.3906000000000031 | 0.238 |
| 0.3908800000000031 | 0.239 |
| 0.3911600000000031 | 0.239 |
| 0.3914400000000031 | 0.24 |
| 0.3917200000000031 | 0.24 |
| 0.3920000000000031 | 0.241 |
| 0.3922800000000031 | 0.241 |
| 0.39256000000000313 | 0.242 |
| 0.39284000000000313 | 0.242 |
| 0.39312000000000313 | 0.243 |
| 0.39340000000000314 | 0.243 |
| 0.39368000000000314 | 0.244 |
| 0.39396000000000314 | 0.244 |
| 0.39424000000000314 | 0.245 |
| 0.39452000000000315 | 0.245 |
| 0.39480000000000315 | 0.246 |
| 0.39508000000000315 | 0.246 |
| 0.39536000000000315 | 0.246 |
| 0.39564000000000316 | 0.247 |
| 0.39592000000000316 | 0.247 |
| 0.39620000000000316 | 0.247 |
| 0.39648000000000316 | 0.248 |
| 0.39676000000000317 | 0.248 |
| 0.39704000000000317 | 0.249 |
| 0.39732000000000317 | 0.249 |
| 0.3976000000000032 | 0.249 |
| 0.3978800000000032 | 0.249 |
| 0.3981600000000032 | 0.25 |
| 0.3984400000000032 | 0.25 |
| 0.3987200000000032 | 0.25 |
| 0.3990000000000032 | 0.251 |
| 0.3992800000000032 | 0.251 |
| 0.3995600000000032 | 0.251 |
| 0.3998400000000032 | 0.251 |
| 0.4001200000000032 | 0.252 |
| 0.4004000000000032 | 0.252 |
| 0.4006800000000032 | 0.252 |
| 0.4009600000000032 | 0.252 |
| 0.4012400000000032 | 0.252 |
| 0.4015200000000032 | 0.252 |
| 0.4018000000000032 | 0.253 |
| 0.4020800000000032 | 0.253 |
| 0.4023600000000032 | 0.253 |
| 0.4026400000000032 | 0.253 |
| 0.4029200000000032 | 0.253 |
| 0.4032000000000032 | 0.253 |
| 0.4034800000000032 | 0.253 |
| 0.4037600000000032 | 0.254 |
| 0.40404000000000323 | 0.254 |
| 0.40432000000000323 | 0.254 |
| 0.40460000000000323 | 0.254 |
| 0.40488000000000324 | 0.254 |
| 0.40516000000000324 | 0.254 |
| 0.40544000000000324 | 0.254 |
| 0.40572000000000324 | 0.254 |
| 0.40600000000000325 | 0.254 |
| 0.40628000000000325 | 0.254 |
| 0.40656000000000325 | 0.254 |
| 0.40684000000000325 | 0.254 |
| 0.40712000000000326 | 0.254 |
| 0.40740000000000326 | 0.254 |
| 0.40768000000000326 | 0.254 |
| 0.40796000000000326 | 0.254 |
| 0.40824000000000327 | 0.254 |
| 0.40852000000000327 | 0.254 |
| 0.40880000000000327 | 0.254 |
| 0.4090800000000033 | 0.253 |
| 0.4093600000000033 | 0.253 |
| 0.4096400000000033 | 0.253 |
| 0.4099200000000033 | 0.253 |
| 0.4102000000000033 | 0.253 |
| 0.4104800000000033 | 0.253 |
| 0.4107600000000033 | 0.253 |
| 0.4110400000000033 | 0.253 |
| 0.4113200000000033 | 0.252 |
| 0.4116000000000033 | 0.252 |
| 0.4118800000000033 | 0.252 |
| 0.4121600000000033 | 0.252 |
| 0.4124400000000033 | 0.252 |
| 0.4127200000000033 | 0.251 |
| 0.4130000000000033 | 0.251 |
| 0.4132800000000033 | 0.251 |
| 0.4135600000000033 | 0.251 |
| 0.4138400000000033 | 0.25 |
| 0.4141200000000033 | 0.25 |
| 0.4144000000000033 | 0.25 |
| 0.4146800000000033 | 0.249 |
| 0.4149600000000033 | 0.249 |
| 0.41524000000000333 | 0.249 |
| 0.41552000000000333 | 0.249 |
| 0.41580000000000333 | 0.248 |
| 0.41608000000000334 | 0.248 |
| 0.41636000000000334 | 0.248 |
| 0.41664000000000334 | 0.247 |
| 0.41692000000000334 | 0.247 |
| 0.41720000000000335 | 0.246 |
| 0.41748000000000335 | 0.246 |
| 0.41776000000000335 | 0.246 |
| 0.41804000000000335 | 0.245 |
| 0.41832000000000336 | 0.245 |
| 0.41860000000000336 | 0.244 |
| 0.41888000000000336 | 0.244 |
| 0.41916000000000336 | 0.244 |
| 0.41944000000000337 | 0.243 |
| 0.41972000000000337 | 0.243 |
| 0.42000000000000337 | 0.242 |
| 0.4202800000000034 | 0.242 |
| 0.4205600000000034 | 0.241 |
| 0.4208400000000034 | 0.241 |
| 0.4211200000000034 | 0.24 |
| 0.4214000000000034 | 0.24 |
| 0.4216800000000034 | 0.239 |
| 0.4219600000000034 | 0.239 |
| 0.4222400000000034 | 0.238 |
| 0.4225200000000034 | 0.238 |
| 0.4228000000000034 | 0.237 |
| 0.4230800000000034 | 0.236 |
| 0.4233600000000034 | 0.236 |
| 0.4236400000000034 | 0.235 |
| 0.4239200000000034 | 0.235 |
| 0.4242000000000034 | 0.234 |
| 0.4244800000000034 | 0.233 |
| 0.4247600000000034 | 0.233 |
| 0.4250400000000034 | 0.232 |
| 0.4253200000000034 | 0.232 |
| 0.4256000000000034 | 0.231 |
| 0.4258800000000034 | 0.23 |
| 0.4261600000000034 | 0.23 |
| 0.4264400000000034 | 0.229 |
| 0.42672000000000343 | 0.228 |
| 0.42700000000000343 | 0.228 |
| 0.42728000000000343 | 0.227 |
| 0.42756000000000344 | 0.226 |
| 0.42784000000000344 | 0.225 |
| 0.42812000000000344 | 0.225 |
| 0.42840000000000344 | 0.224 |
| 0.42868000000000345 | 0.223 |
| 0.42896000000000345 | 0.222 |
| 0.42924000000000345 | 0.222 |
| 0.42952000000000345 | 0.221 |
| 0.42980000000000346 | 0.22 |
| 0.43008000000000346 | 0.219 |
| 0.43036000000000346 | 0.219 |
| 0.43064000000000346 | 0.218 |
| 0.43092000000000347 | 0.217 |
| 0.43120000000000347 | 0.216 |
| 0.43148000000000347 | 0.215 |
| 0.4317600000000035 | 0.215 |
| 0.4320400000000035 | 0.214 |
| 0.4323200000000035 | 0.213 |
| 0.4326000000000035 | 0.212 |
| 0.4328800000000035 | 0.211 |
| 0.4331600000000035 | 0.21 |
| 0.4334400000000035 | 0.209 |
| 0.4337200000000035 | 0.209 |
| 0.4340000000000035 | 0.208 |
| 0.4342800000000035 | 0.207 |
| 0.4345600000000035 | 0.206 |
| 0.4348400000000035 | 0.205 |
| 0.4351200000000035 | 0.204 |
| 0.4354000000000035 | 0.203 |
| 0.4356800000000035 | 0.202 |
| 0.4359600000000035 | 0.201 |
| 0.4362400000000035 | 0.2 |
| 0.4365200000000035 | 0.199 |
| 0.4368000000000035 | 0.198 |
| 0.4370800000000035 | 0.197 |
| 0.4373600000000035 | 0.196 |
| 0.4376400000000035 | 0.195 |
| 0.43792000000000353 | 0.194 |
| 0.43820000000000353 | 0.193 |
| 0.43848000000000353 | 0.192 |
| 0.43876000000000354 | 0.191 |
| 0.43904000000000354 | 0.19 |
| 0.43932000000000354 | 0.189 |
| 0.43960000000000354 | 0.188 |
| 0.43988000000000355 | 0.187 |
| 0.44016000000000355 | 0.186 |
| 0.44044000000000355 | 0.185 |
| 0.44072000000000355 | 0.184 |
| 0.44100000000000356 | 0.183 |
| 0.44128000000000356 | 0.182 |
| 0.44156000000000356 | 0.181 |
| 0.44184000000000356 | 0.18 |
| 0.44212000000000357 | 0.179 |
| 0.44240000000000357 | 0.178 |
| 0.44268000000000357 | 0.176 |
| 0.4429600000000036 | 0.175 |
| 0.4432400000000036 | 0.174 |
| 0.4435200000000036 | 0.173 |
| 0.4438000000000036 | 0.172 |
| 0.4440800000000036 | 0.171 |
| 0.4443600000000036 | 0.17 |
| 0.4446400000000036 | 0.169 |
| 0.4449200000000036 | 0.167 |
| 0.4452000000000036 | 0.166 |
| 0.4454800000000036 | 0.165 |
| 0.4457600000000036 | 0.164 |
| 0.4460400000000036 | 0.163 |
| 0.4463200000000036 | 0.161 |
| 0.4466000000000036 | 0.16 |
| 0.4468800000000036 | 0.159 |
| 0.4471600000000036 | 0.158 |
| 0.4474400000000036 | 0.157 |
| 0.4477200000000036 | 0.155 |
| 0.4480000000000036 | 0.154 |
| 0.4482800000000036 | 0.153 |
| 0.4485600000000036 | 0.152 |
| 0.4488400000000036 | 0.151 |
| 0.4491200000000036 | 0.149 |
| 0.44940000000000363 | 0.148 |
| 0.44968000000000363 | 0.147 |
| 0.44996000000000363 | 0.146 |
| 0.45024000000000364 | 0.144 |
| 0.45052000000000364 | 0.143 |
| 0.45080000000000364 | 0.142 |
| 0.45108000000000364 | 0.141 |
| 0.45136000000000365 | 0.139 |
| 0.45164000000000365 | 0.138 |
| 0.45192000000000365 | 0.137 |
| 0.45220000000000365 | 0.135 |
| 0.45248000000000366 | 0.134 |
| 0.45276000000000366 | 0.133 |
| 0.45304000000000366 | 0.132 |
| 0.45332000000000366 | 0.13 |
| 0.45360000000000367 | 0.129 |
| 0.45388000000000367 | 0.128 |
| 0.45416000000000367 | 0.126 |
| 0.4544400000000037 | 0.125 |
| 0.4547200000000037 | 0.124 |
| 0.4550000000000037 | 0.122 |
| 0.4552800000000037 | 0.121 |
| 0.4555600000000037 | 0.12 |
| 0.4558400000000037 | 0.118 |
| 0.4561200000000037 | 0.117 |
| 0.4564000000000037 | 0.116 |
| 0.4566800000000037 | 0.114 |
| 0.4569600000000037 | 0.113 |
| 0.4572400000000037 | 0.111 |
| 0.4575200000000037 | 0.11 |
| 0.4578000000000037 | 0.109 |
| 0.4580800000000037 | 0.107 |
| 0.4583600000000037 | 0.106 |
| 0.4586400000000037 | 0.105 |
| 0.4589200000000037 | 0.103 |
| 0.4592000000000037 | 0.102 |
| 0.4594800000000037 | 0.1 |
| 0.4597600000000037 | 0.099 |
| 0.4600400000000037 | 0.098 |
| 0.4603200000000037 | 0.096 |
| 0.46060000000000373 | 0.095 |
| 0.46088000000000373 | 0.093 |
| 0.46116000000000373 | 0.092 |
| 0.46144000000000374 | 0.091 |
| 0.46172000000000374 | 0.089 |
| 0.46200000000000374 | 0.088 |
| 0.46228000000000374 | 0.086 |
| 0.46256000000000375 | 0.085 |
| 0.46284000000000375 | 0.084 |
| 0.46312000000000375 | 0.082 |
| 0.46340000000000375 | 0.081 |
| 0.46368000000000376 | 0.079 |
| 0.46396000000000376 | 0.078 |
| 0.46424000000000376 | 0.076 |
| 0.46452000000000376 | 0.075 |
| 0.46480000000000377 | 0.074 |
| 0.46508000000000377 | 0.072 |
| 0.46536000000000377 | 0.071 |
| 0.4656400000000038 | 0.069 |
| 0.4659200000000038 | 0.068 |
| 0.4662000000000038 | 0.066 |
| 0.4664800000000038 | 0.065 |
| 0.4667600000000038 | 0.063 |
| 0.4670400000000038 | 0.062 |
| 0.4673200000000038 | 0.06 |
| 0.4676000000000038 | 0.059 |
| 0.4678800000000038 | 0.058 |
| 0.4681600000000038 | 0.056 |
| 0.4684400000000038 | 0.055 |
| 0.4687200000000038 | 0.053 |
| 0.4690000000000038 | 0.052 |
| 0.4692800000000038 | 0.05 |
| 0.4695600000000038 | 0.049 |
| 0.4698400000000038 | 0.047 |
| 0.4701200000000038 | 0.046 |
| 0.4704000000000038 | 0.044 |
| 0.4706800000000038 | 0.043 |
| 0.4709600000000038 | 0.041 |
| 0.4712400000000038 | 0.04 |
| 0.4715200000000038 | 0.039 |
| 0.4718000000000038 | 0.037 |
| 0.47208000000000383 | 0.036 |
| 0.47236000000000383 | 0.034 |
| 0.47264000000000383 | 0.033 |
| 0.47292000000000384 | 0.031 |
| 0.47320000000000384 | 0.03 |
| 0.47348000000000384 | 0.028 |
| 0.47376000000000384 | 0.027 |
| 0.47404000000000385 | 0.025 |
| 0.47432000000000385 | 0.024 |
| 0.47460000000000385 | 0.022 |
| 0.47488000000000385 | 0.021 |
| 0.47516000000000386 | 0.019 |
| 0.47544000000000386 | 0.018 |
| 0.47572000000000386 | 0.016 |
| 0.47600000000000386 | 0.015 |
| 0.47628000000000387 | 0.013 |
| 0.47656000000000387 | 0.012 |
| 0.47684000000000387 | 0.011 |
| 0.4771200000000039 | 0.009 |
| 0.4774000000000039 | 0.008 |
| 0.4776800000000039 | 0.006 |
| 0.4779600000000039 | 0.005 |
| 0.4782400000000039 | 0.003 |
| 0.4785200000000039 | 0.002 |
| 0.4788000000000039 | 0 |
| 0.4790800000000039 | -0.001 |
| 0.4793600000000039 | -0.003 |
| 0.4796400000000039 | -0.004 |
| 0.4799200000000039 | -0.006 |
| 0.4802000000000039 | -0.007 |
| 0.4804800000000039 | -0.009 |
| 0.4807600000000039 | -0.01 |
| 0.4810400000000039 | -0.011 |
| 0.4813200000000039 | -0.013 |
| 0.4816000000000039 | -0.014 |
| 0.4818800000000039 | -0.016 |
| 0.4821600000000039 | -0.017 |
| 0.4824400000000039 | -0.019 |
| 0.4827200000000039 | -0.02 |
| 0.4830000000000039 | -0.022 |
| 0.48328000000000393 | -0.023 |
| 0.48356000000000393 | -0.024 |
| 0.48384000000000393 | -0.026 |
| 0.48412000000000394 | -0.027 |
| 0.48440000000000394 | -0.029 |
| 0.48468000000000394 | -0.03 |
| 0.48496000000000394 | -0.032 |
| 0.48524000000000395 | -0.033 |
| 0.48552000000000395 | -0.035 |
| 0.48580000000000395 | -0.036 |
| 0.48608000000000395 | -0.037 |
| 0.48636000000000396 | -0.039 |
| 0.48664000000000396 | -0.04 |
| 0.48692000000000396 | -0.042 |
| 0.48720000000000396 | -0.043 |
| 0.48748000000000397 | -0.044 |
| 0.48776000000000397 | -0.046 |
| 0.48804000000000397 | -0.047 |
| 0.488320000000004 | -0.049 |
| 0.488600000000004 | -0.05 |
| 0.488880000000004 | -0.051 |
| 0.489160000000004 | -0.053 |
| 0.489440000000004 | -0.054 |
| 0.489720000000004 | -0.056 |
| 0.490000000000004 | -0.057 |
| 0.490280000000004 | -0.058 |
| 0.490560000000004 | -0.06 |
| 0.490840000000004 | -0.061 |
| 0.491120000000004 | -0.063 |
| 0.491400000000004 | -0.064 |
| 0.491680000000004 | -0.065 |
| 0.491960000000004 | -0.067 |
| 0.492240000000004 | -0.068 |
| 0.492520000000004 | -0.069 |
| 0.492800000000004 | -0.071 |
| 0.493080000000004 | -0.072 |
| 0.493360000000004 | -0.073 |
| 0.493640000000004 | -0.075 |
| 0.493920000000004 | -0.076 |
| 0.494200000000004 | -0.077 |
| 0.494480000000004 | -0.079 |
| 0.49476000000000403 | -0.08 |
| 0.49504000000000403 | -0.081 |
| 0.49532000000000403 | -0.083 |
| 0.49560000000000404 | -0.084 |
| 0.49588000000000404 | -0.085 |
| 0.49616000000000404 | -0.087 |
| 0.49644000000000404 | -0.088 |
| 0.49672000000000405 | -0.089 |
| 0.49700000000000405 | -0.091 |
| 0.49728000000000405 | -0.092 |
| 0.49756000000000405 | -0.093 |
| 0.49784000000000406 | -0.094 |
| 0.49812000000000406 | -0.096 |
| 0.49840000000000406 | -0.097 |
| 0.49868000000000406 | -0.098 |
| 0.49896000000000407 | -0.1 |
| 0.49924000000000407 | -0.101 |
| 0.49952000000000407 | -0.102 |
| 0.4998000000000041 | -0.103 |
| 0.5000800000000041 | -0.105 |
| 0.500360000000004 | -0.106 |
| 0.500640000000004 | -0.107 |
| 0.5009200000000039 | -0.108 |
| 0.5012000000000039 | -0.109 |
| 0.5014800000000038 | -0.111 |
| 0.5017600000000038 | -0.112 |
| 0.5020400000000037 | -0.113 |
| 0.5023200000000037 | -0.114 |
| 0.5026000000000036 | -0.115 |
| 0.5028800000000035 | -0.117 |
| 0.5031600000000035 | -0.118 |
| 0.5034400000000034 | -0.119 |
| 0.5037200000000034 | -0.12 |
| 0.5040000000000033 | -0.121 |
| 0.5042800000000033 | -0.123 |
| 0.5045600000000032 | -0.124 |
| 0.5048400000000032 | -0.125 |
| 0.5051200000000031 | -0.126 |
| 0.5054000000000031 | -0.127 |
| 0.505680000000003 | -0.128 |
| 0.505960000000003 | -0.129 |
| 0.5062400000000029 | -0.131 |
| 0.5065200000000029 | -0.132 |
| 0.5068000000000028 | -0.133 |
| 0.5070800000000028 | -0.134 |
| 0.5073600000000027 | -0.135 |
| 0.5076400000000026 | -0.136 |
| 0.5079200000000026 | -0.137 |
| 0.5082000000000025 | -0.138 |
| 0.5084800000000025 | -0.139 |
| 0.5087600000000024 | -0.14 |
| 0.5090400000000024 | -0.141 |
| 0.5093200000000023 | -0.143 |
| 0.5096000000000023 | -0.144 |
| 0.5098800000000022 | -0.145 |
| 0.5101600000000022 | -0.146 |
| 0.5104400000000021 | -0.147 |
| 0.5107200000000021 | -0.148 |
| 0.511000000000002 | -0.149 |
| 0.511280000000002 | -0.15 |
| 0.5115600000000019 | -0.151 |
| 0.5118400000000018 | -0.152 |
| 0.5121200000000018 | -0.153 |
| 0.5124000000000017 | -0.154 |
| 0.5126800000000017 | -0.155 |
| 0.5129600000000016 | -0.156 |
| 0.5132400000000016 | -0.157 |
| 0.5135200000000015 | -0.158 |
| 0.5138000000000015 | -0.159 |
| 0.5140800000000014 | -0.16 |
| 0.5143600000000014 | -0.161 |
| 0.5146400000000013 | -0.161 |
| 0.5149200000000013 | -0.162 |
| 0.5152000000000012 | -0.163 |
| 0.5154800000000012 | -0.164 |
| 0.5157600000000011 | -0.165 |
| 0.516040000000001 | -0.166 |
| 0.516320000000001 | -0.167 |
| 0.516600000000001 | -0.168 |
| 0.5168800000000009 | -0.169 |
| 0.5171600000000008 | -0.17 |
| 0.5174400000000008 | -0.17 |
| 0.5177200000000007 | -0.171 |
| 0.5180000000000007 | -0.172 |
| 0.5182800000000006 | -0.173 |
| 0.5185600000000006 | -0.174 |
| 0.5188400000000005 | -0.175 |
| 0.5191200000000005 | -0.175 |
| 0.5194000000000004 | -0.176 |
| 0.5196800000000004 | -0.177 |
| 0.5199600000000003 | -0.178 |
| 0.5202400000000003 | -0.179 |
| 0.5205200000000002 | -0.179 |
| 0.5208000000000002 | -0.18 |
| 0.5210800000000001 | -0.181 |
| 0.52136 | -0.182 |
| 0.52164 | -0.183 |
| 0.5219199999999999 | -0.183 |
| 0.5221999999999999 | -0.184 |
| 0.5224799999999998 | -0.185 |
| 0.5227599999999998 | -0.185 |
| 0.5230399999999997 | -0.186 |
| 0.5233199999999997 | -0.187 |
| 0.5235999999999996 | -0.188 |
| 0.5238799999999996 | -0.188 |
| 0.5241599999999995 | -0.189 |
| 0.5244399999999995 | -0.19 |
| 0.5247199999999994 | -0.19 |
| 0.5249999999999994 | -0.191 |
| 0.5252799999999993 | -0.192 |
| 0.5255599999999992 | -0.192 |
| 0.5258399999999992 | -0.193 |
| 0.5261199999999991 | -0.194 |
| 0.5263999999999991 | -0.194 |
| 0.526679999999999 | -0.195 |
| 0.526959999999999 | -0.195 |
| 0.5272399999999989 | -0.196 |
| 0.5275199999999989 | -0.197 |
| 0.5277999999999988 | -0.197 |
| 0.5280799999999988 | -0.198 |
| 0.5283599999999987 | -0.198 |
| 0.5286399999999987 | -0.199 |
| 0.5289199999999986 | -0.199 |
| 0.5291999999999986 | -0.2 |
| 0.5294799999999985 | -0.2 |
| 0.5297599999999985 | -0.201 |
| 0.5300399999999984 | -0.201 |
| 0.5303199999999983 | -0.202 |
| 0.5305999999999983 | -0.202 |
| 0.5308799999999982 | -0.203 |
| 0.5311599999999982 | -0.203 |
| 0.5314399999999981 | -0.204 |
| 0.5317199999999981 | -0.204 |
| 0.531999999999998 | -0.205 |
| 0.532279999999998 | -0.205 |
| 0.5325599999999979 | -0.206 |
| 0.5328399999999979 | -0.206 |
| 0.5331199999999978 | -0.207 |
| 0.5333999999999978 | -0.207 |
| 0.5336799999999977 | -0.207 |
| 0.5339599999999977 | -0.208 |
| 0.5342399999999976 | -0.208 |
| 0.5345199999999976 | -0.209 |
| 0.5347999999999975 | -0.209 |
| 0.5350799999999974 | -0.209 |
| 0.5353599999999974 | -0.21 |
| 0.5356399999999973 | -0.21 |
| 0.5359199999999973 | -0.21 |
| 0.5361999999999972 | -0.211 |
| 0.5364799999999972 | -0.211 |
| 0.5367599999999971 | -0.211 |
| 0.5370399999999971 | -0.212 |
| 0.537319999999997 | -0.212 |
| 0.537599999999997 | -0.212 |
| 0.5378799999999969 | -0.213 |
| 0.5381599999999969 | -0.213 |
| 0.5384399999999968 | -0.213 |
| 0.5387199999999968 | -0.213 |
| 0.5389999999999967 | -0.214 |
| 0.5392799999999967 | -0.214 |
| 0.5395599999999966 | -0.214 |
| 0.5398399999999965 | -0.214 |
| 0.5401199999999965 | -0.214 |
| 0.5403999999999964 | -0.215 |
| 0.5406799999999964 | -0.215 |
| 0.5409599999999963 | -0.215 |
| 0.5412399999999963 | -0.215 |
| 0.5415199999999962 | -0.215 |
| 0.5417999999999962 | -0.216 |
| 0.5420799999999961 | -0.216 |
| 0.5423599999999961 | -0.216 |
| 0.542639999999996 | -0.216 |
| 0.542919999999996 | -0.216 |
| 0.5431999999999959 | -0.216 |
| 0.5434799999999959 | -0.216 |
| 0.5437599999999958 | -0.216 |
| 0.5440399999999957 | -0.217 |
| 0.5443199999999957 | -0.217 |
| 0.5445999999999956 | -0.217 |
| 0.5448799999999956 | -0.217 |
| 0.5451599999999955 | -0.217 |
| 0.5454399999999955 | -0.217 |
| 0.5457199999999954 | -0.217 |
| 0.5459999999999954 | -0.217 |
| 0.5462799999999953 | -0.217 |
| 0.5465599999999953 | -0.217 |
| 0.5468399999999952 | -0.217 |
| 0.5471199999999952 | -0.217 |
| 0.5473999999999951 | -0.217 |
| 0.5476799999999951 | -0.217 |
| 0.547959999999995 | -0.217 |
| 0.548239999999995 | -0.217 |
| 0.5485199999999949 | -0.217 |
| 0.5487999999999948 | -0.217 |
| 0.5490799999999948 | -0.217 |
| 0.5493599999999947 | -0.217 |
| 0.5496399999999947 | -0.217 |
| 0.5499199999999946 | -0.217 |
| 0.5501999999999946 | -0.216 |
| 0.5504799999999945 | -0.216 |
| 0.5507599999999945 | -0.216 |
| 0.5510399999999944 | -0.216 |
| 0.5513199999999944 | -0.216 |
| 0.5515999999999943 | -0.216 |
| 0.5518799999999943 | -0.216 |
| 0.5521599999999942 | -0.216 |
| 0.5524399999999942 | -0.215 |
| 0.5527199999999941 | -0.215 |
| 0.552999999999994 | -0.215 |
| 0.553279999999994 | -0.215 |
| 0.553559999999994 | -0.215 |
| 0.5538399999999939 | -0.214 |
| 0.5541199999999938 | -0.214 |
| 0.5543999999999938 | -0.214 |
| 0.5546799999999937 | -0.214 |
| 0.5549599999999937 | -0.214 |
| 0.5552399999999936 | -0.213 |
| 0.5555199999999936 | -0.213 |
| 0.5557999999999935 | -0.213 |
| 0.5560799999999935 | -0.213 |
| 0.5563599999999934 | -0.212 |
| 0.5566399999999934 | -0.212 |
| 0.5569199999999933 | -0.212 |
| 0.5571999999999933 | -0.211 |
| 0.5574799999999932 | -0.211 |
| 0.5577599999999932 | -0.211 |
| 0.5580399999999931 | -0.21 |
| 0.558319999999993 | -0.21 |
| 0.558599999999993 | -0.21 |
| 0.5588799999999929 | -0.209 |
| 0.5591599999999929 | -0.209 |
| 0.5594399999999928 | -0.209 |
| 0.5597199999999928 | -0.208 |
| 0.5599999999999927 | -0.208 |
| 0.5602799999999927 | -0.208 |
| 0.5605599999999926 | -0.207 |
| 0.5608399999999926 | -0.207 |
| 0.5611199999999925 | -0.206 |
| 0.5613999999999925 | -0.206 |
| 0.5616799999999924 | -0.205 |
| 0.5619599999999924 | -0.205 |
| 0.5622399999999923 | -0.205 |
| 0.5625199999999922 | -0.204 |
| 0.5627999999999922 | -0.204 |
| 0.5630799999999921 | -0.203 |
| 0.5633599999999921 | -0.203 |
| 0.563639999999992 | -0.202 |
| 0.563919999999992 | -0.202 |
| 0.5641999999999919 | -0.201 |
| 0.5644799999999919 | -0.201 |
| 0.5647599999999918 | -0.2 |
| 0.5650399999999918 | -0.2 |
| 0.5653199999999917 | -0.199 |
| 0.5655999999999917 | -0.199 |
| 0.5658799999999916 | -0.198 |
| 0.5661599999999916 | -0.198 |
| 0.5664399999999915 | -0.197 |
| 0.5667199999999915 | -0.196 |
| 0.5669999999999914 | -0.196 |
| 0.5672799999999913 | -0.195 |
| 0.5675599999999913 | -0.195 |
| 0.5678399999999912 | -0.194 |
| 0.5681199999999912 | -0.193 |
| 0.5683999999999911 | -0.193 |
| 0.5686799999999911 | -0.192 |
| 0.568959999999991 | -0.192 |
| 0.569239999999991 | -0.191 |
| 0.5695199999999909 | -0.19 |
| 0.5697999999999909 | -0.19 |
| 0.5700799999999908 | -0.189 |
| 0.5703599999999908 | -0.188 |
| 0.5706399999999907 | -0.188 |
| 0.5709199999999907 | -0.187 |
| 0.5711999999999906 | -0.186 |
| 0.5714799999999906 | -0.186 |
| 0.5717599999999905 | -0.185 |
| 0.5720399999999904 | -0.184 |
| 0.5723199999999904 | -0.184 |
| 0.5725999999999903 | -0.183 |
| 0.5728799999999903 | -0.182 |
| 0.5731599999999902 | -0.181 |
| 0.5734399999999902 | -0.181 |
| 0.5737199999999901 | -0.18 |
| 0.5739999999999901 | -0.179 |
| 0.57427999999999 | -0.178 |
| 0.57455999999999 | -0.178 |
| 0.5748399999999899 | -0.177 |
| 0.5751199999999899 | -0.176 |
| 0.5753999999999898 | -0.175 |
| 0.5756799999999898 | -0.175 |
| 0.5759599999999897 | -0.174 |
| 0.5762399999999896 | -0.173 |
| 0.5765199999999896 | -0.172 |
| 0.5767999999999895 | -0.171 |
| 0.5770799999999895 | -0.171 |
| 0.5773599999999894 | -0.17 |
| 0.5776399999999894 | -0.169 |
| 0.5779199999999893 | -0.168 |
| 0.5781999999999893 | -0.167 |
| 0.5784799999999892 | -0.166 |
| 0.5787599999999892 | -0.166 |
| 0.5790399999999891 | -0.165 |
| 0.5793199999999891 | -0.164 |
| 0.579599999999989 | -0.163 |
| 0.579879999999989 | -0.162 |
| 0.5801599999999889 | -0.161 |
| 0.5804399999999889 | -0.16 |
| 0.5807199999999888 | -0.159 |
| 0.5809999999999887 | -0.159 |
| 0.5812799999999887 | -0.158 |
| 0.5815599999999886 | -0.157 |
| 0.5818399999999886 | -0.156 |
| 0.5821199999999885 | -0.155 |
| 0.5823999999999885 | -0.154 |
| 0.5826799999999884 | -0.153 |
| 0.5829599999999884 | -0.152 |
| 0.5832399999999883 | -0.151 |
| 0.5835199999999883 | -0.15 |
| 0.5837999999999882 | -0.149 |
| 0.5840799999999882 | -0.148 |
| 0.5843599999999881 | -0.147 |
| 0.5846399999999881 | -0.146 |
| 0.584919999999988 | -0.145 |
| 0.585199999999988 | -0.144 |
| 0.5854799999999879 | -0.143 |
| 0.5857599999999878 | -0.142 |
| 0.5860399999999878 | -0.141 |
| 0.5863199999999877 | -0.14 |
| 0.5865999999999877 | -0.139 |
| 0.5868799999999876 | -0.138 |
| 0.5871599999999876 | -0.137 |
| 0.5874399999999875 | -0.136 |
| 0.5877199999999875 | -0.135 |
| 0.5879999999999874 | -0.134 |
| 0.5882799999999874 | -0.133 |
| 0.5885599999999873 | -0.132 |
| 0.5888399999999873 | -0.131 |
| 0.5891199999999872 | -0.13 |
| 0.5893999999999872 | -0.129 |
| 0.5896799999999871 | -0.128 |
| 0.589959999999987 | -0.127 |
| 0.590239999999987 | -0.126 |
| 0.5905199999999869 | -0.125 |
| 0.5907999999999869 | -0.124 |
| 0.5910799999999868 | -0.123 |
| 0.5913599999999868 | -0.122 |
| 0.5916399999999867 | -0.121 |
| 0.5919199999999867 | -0.119 |
| 0.5921999999999866 | -0.118 |
| 0.5924799999999866 | -0.117 |
| 0.5927599999999865 | -0.116 |
| 0.5930399999999865 | -0.115 |
| 0.5933199999999864 | -0.114 |
| 0.5935999999999864 | -0.113 |
| 0.5938799999999863 | -0.112 |
| 0.5941599999999863 | -0.111 |
| 0.5944399999999862 | -0.109 |
| 0.5947199999999861 | -0.108 |
| 0.5949999999999861 | -0.107 |
| 0.595279999999986 | -0.106 |
| 0.595559999999986 | -0.105 |
| 0.5958399999999859 | -0.104 |
| 0.5961199999999859 | -0.103 |
| 0.5963999999999858 | -0.102 |
| 0.5966799999999858 | -0.1 |
| 0.5969599999999857 | -0.099 |
| 0.5972399999999857 | -0.098 |
| 0.5975199999999856 | -0.097 |
| 0.5977999999999856 | -0.096 |
| 0.5980799999999855 | -0.095 |
| 0.5983599999999855 | -0.093 |
| 0.5986399999999854 | -0.092 |
| 0.5989199999999854 | -0.091 |
| 0.5991999999999853 | -0.09 |
| 0.5994799999999852 | -0.089 |
| 0.5997599999999852 | -0.087 |
| 0.6000399999999851 | -0.086 |
| 0.6003199999999851 | -0.085 |
| 0.600599999999985 | -0.084 |
| 0.600879999999985 | -0.083 |
| 0.6011599999999849 | -0.082 |
| 0.6014399999999849 | -0.08 |
| 0.6017199999999848 | -0.079 |
| 0.6019999999999848 | -0.078 |
| 0.6022799999999847 | -0.077 |
| 0.6025599999999847 | -0.076 |
| 0.6028399999999846 | -0.074 |
| 0.6031199999999846 | -0.073 |
| 0.6033999999999845 | -0.072 |
| 0.6036799999999845 | -0.071 |
| 0.6039599999999844 | -0.069 |
| 0.6042399999999843 | -0.068 |
| 0.6045199999999843 | -0.067 |
| 0.6047999999999842 | -0.066 |
| 0.6050799999999842 | -0.065 |
| 0.6053599999999841 | -0.063 |
| 0.6056399999999841 | -0.062 |
| 0.605919999999984 | -0.061 |
| 0.606199999999984 | -0.06 |
| 0.6064799999999839 | -0.058 |
| 0.6067599999999839 | -0.057 |
| 0.6070399999999838 | -0.056 |
| 0.6073199999999838 | -0.055 |
| 0.6075999999999837 | -0.053 |
| 0.6078799999999837 | -0.052 |
| 0.6081599999999836 | -0.051 |
| 0.6084399999999835 | -0.05 |
| 0.6087199999999835 | -0.048 |
| 0.6089999999999834 | -0.047 |
| 0.6092799999999834 | -0.046 |
| 0.6095599999999833 | -0.045 |
| 0.6098399999999833 | -0.043 |
| 0.6101199999999832 | -0.042 |
| 0.6103999999999832 | -0.041 |
| 0.6106799999999831 | -0.04 |
| 0.6109599999999831 | -0.038 |
| 0.611239999999983 | -0.037 |
| 0.611519999999983 | -0.036 |
| 0.6117999999999829 | -0.035 |
| 0.6120799999999829 | -0.033 |
| 0.6123599999999828 | -0.032 |
| 0.6126399999999828 | -0.031 |
| 0.6129199999999827 | -0.03 |
| 0.6131999999999826 | -0.028 |
| 0.6134799999999826 | -0.027 |
| 0.6137599999999825 | -0.026 |
| 0.6140399999999825 | -0.025 |